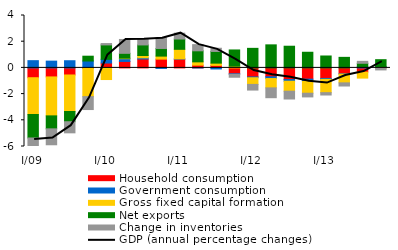
| Category | Household consumption | Government consumption | Gross fixed capital formation | Net exports | Change in inventories |
|---|---|---|---|---|---|
| I/09 | -0.75 | 0.552 | -2.81 | -1.79 | -0.668 |
| II | -0.689 | 0.517 | -2.973 | -0.99 | -1.215 |
| III | -0.541 | 0.548 | -2.787 | -0.781 | -0.848 |
| IV | -0.026 | 0.526 | -2.167 | 0.367 | -0.986 |
| I/10 | 0.372 | 0.283 | -0.889 | 1.099 | 0.104 |
| II | 0.495 | 0.207 | 0.042 | 0.369 | 1.058 |
| III | 0.68 | 0.089 | 0.179 | 0.806 | 0.43 |
| IV | 0.67 | -0.039 | 0.23 | 0.583 | 0.815 |
| I/11 | 0.669 | 0.019 | 0.73 | 0.785 | 0.447 |
| II | 0.209 | -0.004 | 0.253 | 0.843 | 0.472 |
| III | 0.191 | -0.082 | 0.173 | 0.893 | 0.244 |
| IV | -0.449 | -0.036 | 0.135 | 1.234 | -0.229 |
| I/12 | -0.691 | -0.062 | -0.508 | 1.493 | -0.432 |
| II | -0.676 | -0.136 | -0.712 | 1.759 | -0.75 |
| III | -0.891 | -0.126 | -0.763 | 1.654 | -0.595 |
| IV | -0.859 | -0.177 | -0.897 | 1.194 | -0.282 |
| I/13 | -0.804 | -0.07 | -1.015 | 0.909 | -0.18 |
| II | -0.452 | -0.022 | -0.668 | 0.805 | -0.241 |
| III | -0.324 | 0.104 | -0.454 | 0.248 | 0.149 |
| IV | 0.054 | 0.052 | -0.008 | 0.521 | -0.145 |